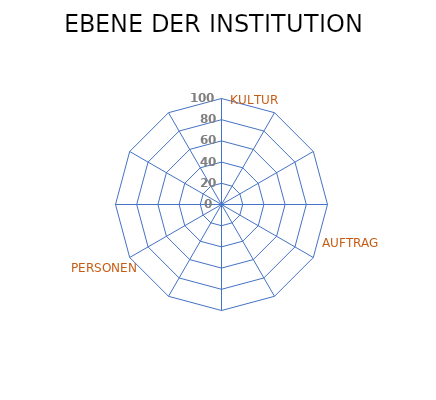
| Category | Series 0 |
|---|---|
| STEUERUNG | 0 |
| STRATEGIE | 0 |
| INTEGR. KONTEXT | 0 |
| MESSUNG | 0 |
| LEHRPLÄNE | 0 |
| FORSCHUNG | 0 |
| REICHWEITE | 0 |
| FINANZIERUNG | 0 |
| IDENTIFIKATION | 0 |
| KONSULTATION | 0 |
| EINBINDUNG | 0 |
| CO-CREATION | 0 |